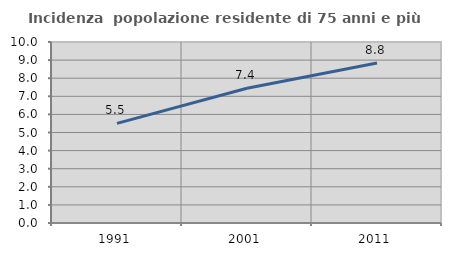
| Category | Incidenza  popolazione residente di 75 anni e più |
|---|---|
| 1991.0 | 5.502 |
| 2001.0 | 7.444 |
| 2011.0 | 8.843 |